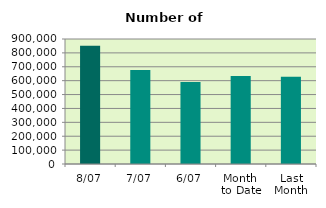
| Category | Series 0 |
|---|---|
| 8/07 | 851558 |
| 7/07 | 676958 |
| 6/07 | 590736 |
| Month 
to Date | 633578.667 |
| Last
Month | 628899 |